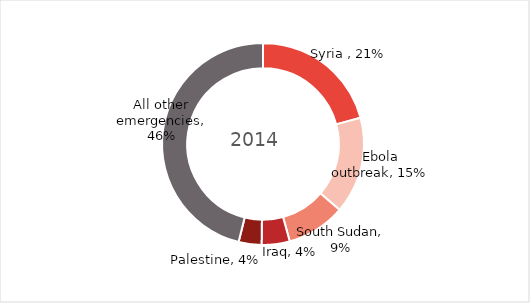
| Category | Series 0 |
|---|---|
| Syria  | 0.208 |
| Ebola outbreak | 0.155 |
| South Sudan | 0.094 |
| Iraq | 0.045 |
| Palestine | 0.037 |
| All other emergencies | 0.461 |